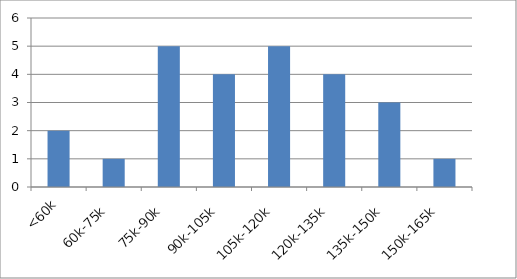
| Category | Series 0 |
|---|---|
| <60k | 2 |
| 60k-75k | 1 |
| 75k-90k | 5 |
| 90k-105k | 4 |
| 105k-120k | 5 |
| 120k-135k | 4 |
| 135k-150k | 3 |
| 150k-165k | 1 |